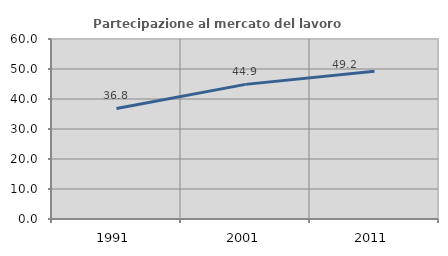
| Category | Partecipazione al mercato del lavoro  femminile |
|---|---|
| 1991.0 | 36.837 |
| 2001.0 | 44.874 |
| 2011.0 | 49.214 |